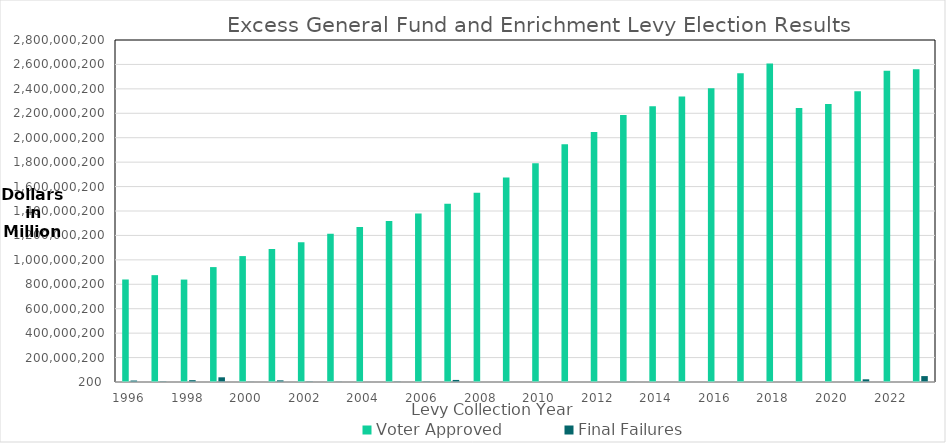
| Category | Voter Approved | Final Failures |
|---|---|---|
| 1996 | 839318107 | 12089175 |
| 1997 | 874789668 | 3765443 |
| 1998 | 838604584 | 15047453 |
| 1999 | 940765937 | 38481902 |
| 2000 | 1030873759 | 1268399 |
| 2001 | 1088088126 | 13438599 |
| 2002 | 1143919081 | 3533559 |
| 2003 | 1212816864 | 1907738 |
| 2004 | 1268819341 | 482851 |
| 2005 | 1317841524 | 3338000 |
| 2006 | 1380248875 | 3947759 |
| 2007 | 1459700998 | 16940636 |
| 2008 | 1549670919 | 225000 |
| 2009 | 1674487111 | 347952 |
| 2010 | 1791463918 | 349181 |
| 2011 | 1945703236 | 0 |
| 2012 | 2046703841 | 245000 |
| 2013 | 2184995410 | 838000 |
| 2014 | 2257657771 | 0 |
| 2015 | 2338026390 | 117000 |
| 2016 | 2405746819 | 117000 |
| 2017 | 2527706168 | 0 |
| 2018 | 2606634102 | 0 |
| 2019 | 2243795589 | 0 |
| 2020 | 2276315760 | 0 |
| 2021 | 2380406000 | 22016023 |
| 2022 | 2547417684 | 0 |
| 2023 | 2559873129 | 48415780 |